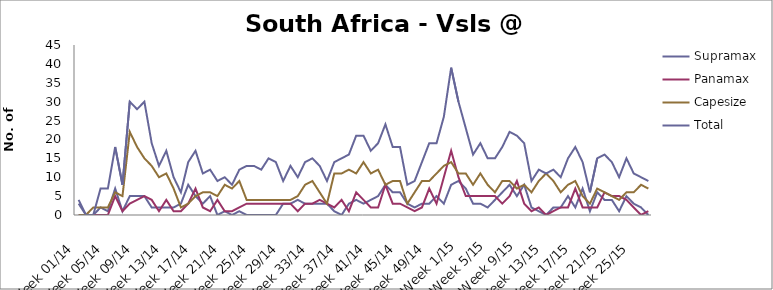
| Category | Supramax | Panamax | Capesize | Total |
|---|---|---|---|---|
| Week 01/14 | 3 | 0 | 0 | 4 |
| Week 02/14 | 0 | 0 | 0 | 0 |
| Week 03/14 | 0 | 0 | 2 | 0 |
| Week 04/14 | 2 | 0 | 2 | 7 |
| Week 05/14 | 1 | 0 | 2 | 7 |
| Week 06/14 | 7 | 5 | 6 | 18 |
| Week 07/14 | 1 | 1 | 5 | 8 |
| Week 08/14 | 5 | 3 | 22 | 30 |
| Week 09/14 | 5 | 4 | 18 | 28 |
| Week 10/14 | 5 | 5 | 15 | 30 |
| Week 11/14 | 2 | 4 | 13 | 19 |
| Week 12/14 | 2 | 1 | 10 | 13 |
| Week 13/14 | 2 | 4 | 11 | 17 |
| Week 14/14 | 2 | 1 | 7 | 10 |
| Week 15/14 | 3 | 1 | 2 | 6 |
| Week 16/14 | 8 | 3 | 3 | 14 |
| Week 17/14 | 5 | 7 | 5 | 17 |
| Week 18/14 | 3 | 2 | 6 | 11 |
| Week 19/14 | 5 | 1 | 6 | 12 |
| Week 20/14 | 0 | 4 | 5 | 9 |
| Week 21/14 | 1 | 1 | 8 | 10 |
| Week 22/14 | 0 | 1 | 7 | 8 |
| Week 23/14 | 1 | 2 | 9 | 12 |
| Week 24/14 | 0 | 3 | 4 | 13 |
| Week 25/14 | 0 | 3 | 4 | 13 |
| Week 26/14 | 0 | 3 | 4 | 12 |
| Week 27/14 | 0 | 3 | 4 | 15 |
| Week 28/14 | 0 | 3 | 4 | 14 |
| Week 29/14 | 3 | 3 | 4 | 9 |
| Week 30/14 | 3 | 3 | 4 | 13 |
| Week 31/14 | 4 | 1 | 5 | 10 |
| Week 32/14 | 3 | 3 | 8 | 14 |
| Week 33/14 | 3 | 3 | 9 | 15 |
| Week 34/14 | 3 | 4 | 6 | 13 |
| Week 35/14 | 3 | 3 | 3 | 9 |
| Week 36/14 | 1 | 2 | 11 | 14 |
| Week 37/14 | 0 | 4 | 11 | 15 |
| Week 38/14 | 3 | 1 | 12 | 16 |
| Week 39/14 | 4 | 6 | 11 | 21 |
| Week 40/14 | 3 | 4 | 14 | 21 |
| Week 41/14 | 4 | 2 | 11 | 17 |
| Week 42/14 | 5 | 2 | 12 | 19 |
| Week 43/14 | 8 | 8 | 8 | 24 |
| Week 44/14 | 6 | 3 | 9 | 18 |
| Week 45/14 | 6 | 3 | 9 | 18 |
| Week 46/14 | 3 | 2 | 3 | 8 |
| Week 47/14 | 2 | 1 | 6 | 9 |
| Week 48/14 | 3 | 2 | 9 | 14 |
| Week 49/14 | 3 | 7 | 9 | 19 |
| Week 50/14 | 5 | 3 | 11 | 19 |
| Week 51/14 | 3 | 10 | 13 | 26 |
| Week 52/14 | 8 | 17 | 14 | 39 |
| Week 1/15 | 9 | 10 | 11 | 30 |
| Week 2/15 | 7 | 5 | 11 | 23 |
| Week 3/15 | 3 | 5 | 8 | 16 |
| Week 4/15 | 3 | 5 | 11 | 19 |
| Week 5/15 | 2 | 5 | 8 | 15 |
| Week 6/15 | 4 | 5 | 6 | 15 |
| Week 7/15 | 6 | 3 | 9 | 18 |
| Week 8/15 | 8 | 5 | 9 | 22 |
| Week 9/15 | 5 | 9 | 7 | 21 |
| Week 10/15 | 8 | 3 | 8 | 19 |
| Week 11/15 | 2 | 1 | 6 | 9 |
| Week 12/15 | 1 | 2 | 9 | 12 |
| Week 13/15 | 0 | 0 | 11 | 11 |
| Week 14/15 | 2 | 1 | 9 | 12 |
| Week 15/15 | 2 | 2 | 6 | 10 |
| Week 16/15 | 5 | 2 | 8 | 15 |
| Week 17/15 | 2 | 7 | 9 | 18 |
| Week 18/15 | 7 | 2 | 5 | 14 |
| Week 19/15 | 1 | 2 | 3 | 6 |
| Week 20/15 | 6 | 2 | 7 | 15 |
| Week 21/15 | 4 | 6 | 6 | 16 |
| Week 22/15 | 4 | 5 | 5 | 14 |
| Week 23/15 | 1 | 5 | 4 | 10 |
| Week 24/15 | 5 | 4 | 6 | 15 |
| Week 25/15 | 3 | 2 | 6 | 11 |